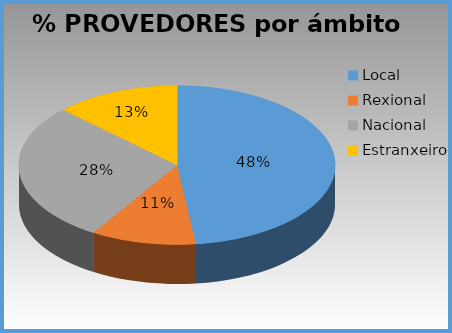
| Category | % provedores |
|---|---|
| Local | 0.481 |
| Rexional | 0.107 |
| Nacional | 0.284 |
| Estranxeiro | 0.128 |